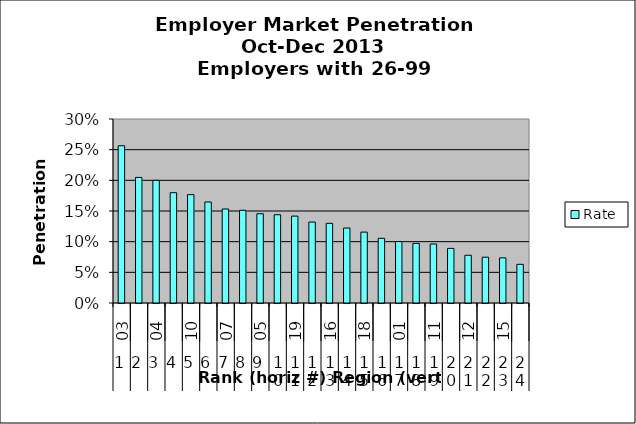
| Category | Rate |
|---|---|
| 0 | 0.256 |
| 1 | 0.205 |
| 2 | 0.2 |
| 3 | 0.18 |
| 4 | 0.177 |
| 5 | 0.165 |
| 6 | 0.153 |
| 7 | 0.151 |
| 8 | 0.145 |
| 9 | 0.144 |
| 10 | 0.142 |
| 11 | 0.132 |
| 12 | 0.13 |
| 13 | 0.122 |
| 14 | 0.116 |
| 15 | 0.105 |
| 16 | 0.1 |
| 17 | 0.097 |
| 18 | 0.096 |
| 19 | 0.089 |
| 20 | 0.078 |
| 21 | 0.075 |
| 22 | 0.074 |
| 23 | 0.063 |